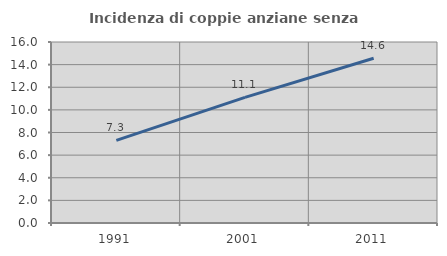
| Category | Incidenza di coppie anziane senza figli  |
|---|---|
| 1991.0 | 7.298 |
| 2001.0 | 11.101 |
| 2011.0 | 14.559 |